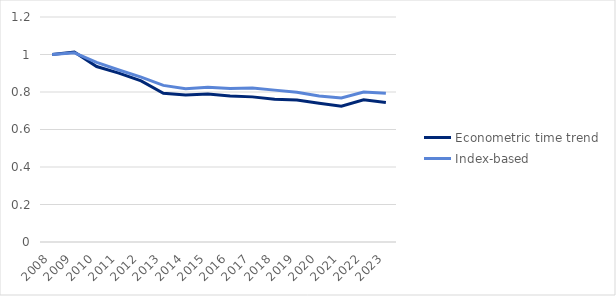
| Category | Econometric time trend | Index-based |
|---|---|---|
| 2008.0 | 1 | 1 |
| 2009.0 | 1.013 | 1.009 |
| 2010.0 | 0.936 | 0.958 |
| 2011.0 | 0.901 | 0.917 |
| 2012.0 | 0.859 | 0.879 |
| 2013.0 | 0.793 | 0.835 |
| 2014.0 | 0.784 | 0.817 |
| 2015.0 | 0.789 | 0.826 |
| 2016.0 | 0.779 | 0.819 |
| 2017.0 | 0.774 | 0.822 |
| 2018.0 | 0.761 | 0.81 |
| 2019.0 | 0.757 | 0.799 |
| 2020.0 | 0.74 | 0.779 |
| 2021.0 | 0.724 | 0.768 |
| 2022.0 | 0.758 | 0.799 |
| 2023.0 | 0.744 | 0.793 |